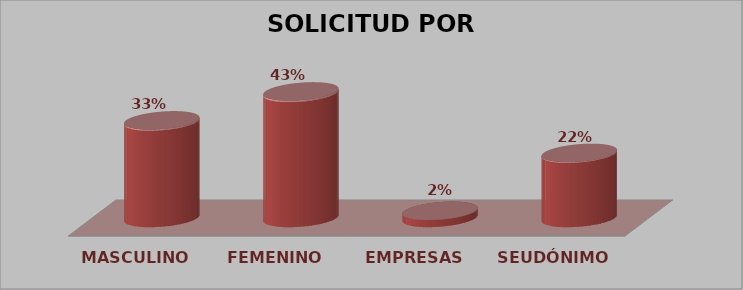
| Category | SOLICITUD POR GÉNERO | Series 1 |
|---|---|---|
| MASCULINO | 27 | 0.329 |
| FEMENINO | 35 | 0.427 |
| EMPRESAS | 2 | 0.024 |
| SEUDÓNIMO | 18 | 0.22 |